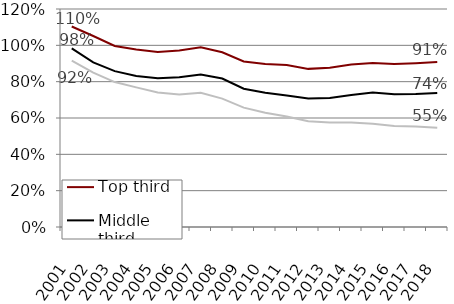
| Category | Top third | Middle third | Bottom third |
|---|---|---|---|
| 2001.0 | 1.104 | 0.984 | 0.915 |
| 2002.0 | 1.051 | 0.906 | 0.85 |
| 2003.0 | 0.997 | 0.858 | 0.798 |
| 2004.0 | 0.978 | 0.831 | 0.769 |
| 2005.0 | 0.964 | 0.819 | 0.74 |
| 2006.0 | 0.972 | 0.824 | 0.73 |
| 2007.0 | 0.989 | 0.839 | 0.739 |
| 2008.0 | 0.962 | 0.817 | 0.707 |
| 2009.0 | 0.911 | 0.761 | 0.657 |
| 2010.0 | 0.897 | 0.739 | 0.629 |
| 2011.0 | 0.892 | 0.724 | 0.609 |
| 2012.0 | 0.87 | 0.707 | 0.582 |
| 2013.0 | 0.876 | 0.71 | 0.575 |
| 2014.0 | 0.894 | 0.726 | 0.575 |
| 2015.0 | 0.902 | 0.74 | 0.569 |
| 2016.0 | 0.897 | 0.731 | 0.556 |
| 2017.0 | 0.901 | 0.732 | 0.554 |
| 2018.0 | 0.908 | 0.737 | 0.547 |